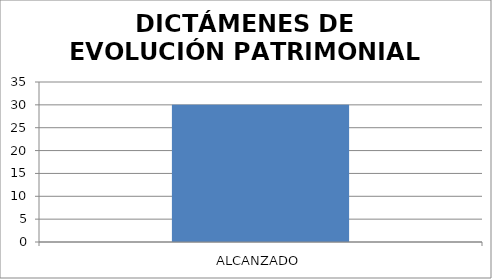
| Category | DICTAMENES DE EVOLUCIÓN PATRIMONIAL |
|---|---|
| ALCANZADO | 30 |